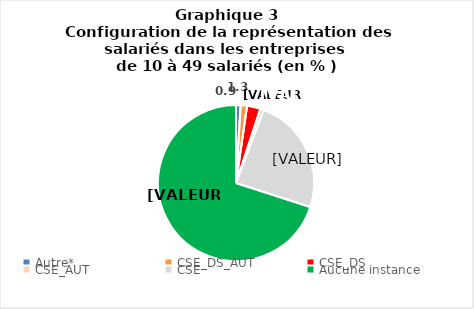
| Category | Series 0 |
|---|---|
| Autre* | 0.94 |
| CSE_DS_AUT | 1.33 |
| CSE_DS | 2.78 |
| CSE_AUT | 0.74 |
| CSE | 24.18 |
| Aucune instance | 70.03 |